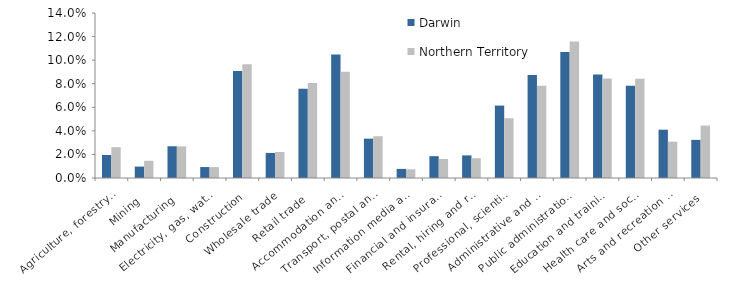
| Category | Darwin | Northern Territory |
|---|---|---|
| Agriculture, forestry and fishing | 0.02 | 0.026 |
| Mining | 0.01 | 0.015 |
| Manufacturing | 0.027 | 0.027 |
| Electricity, gas, water and waste services | 0.009 | 0.009 |
| Construction | 0.091 | 0.097 |
| Wholesale trade | 0.021 | 0.022 |
| Retail trade | 0.076 | 0.081 |
| Accommodation and food services | 0.105 | 0.09 |
| Transport, postal and warehousing | 0.033 | 0.035 |
| Information media and telecommunications | 0.008 | 0.007 |
| Financial and insurance services | 0.019 | 0.016 |
| Rental, hiring and real estate services | 0.019 | 0.017 |
| Professional, scientific and technical services | 0.061 | 0.051 |
| Administrative and support services | 0.087 | 0.078 |
| Public administration and safety | 0.107 | 0.116 |
| Education and training | 0.088 | 0.084 |
| Health care and social assistance | 0.078 | 0.084 |
| Arts and recreation services | 0.041 | 0.031 |
| Other services | 0.032 | 0.045 |